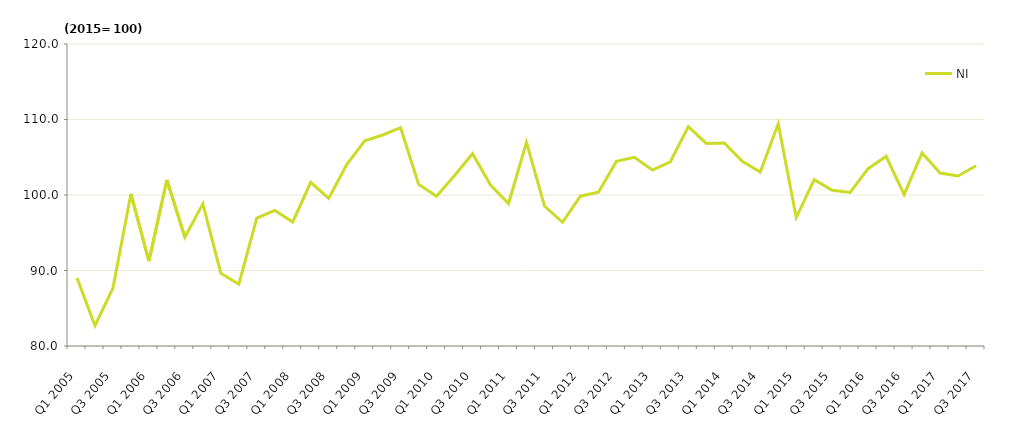
| Category | NI |
|---|---|
| Q1 2005 | 89.015 |
| Q2 2005 | 82.691 |
| Q3 2005 | 87.665 |
| Q4 2005 | 100.156 |
| Q1 2006 | 91.232 |
| Q2 2006 | 101.982 |
| Q3 2006 | 94.416 |
| Q4 2006 | 98.823 |
| Q1 2007 | 89.641 |
| Q2 2007 | 88.179 |
| Q3 2007 | 96.948 |
| Q4 2007 | 97.954 |
| Q1 2008 | 96.43 |
| Q2 2008 | 101.688 |
| Q3 2008 | 99.551 |
| Q4 2008 | 104.033 |
| Q1 2009 | 107.185 |
| Q2 2009 | 107.946 |
| Q3 2009 | 108.915 |
| Q4 2009 | 101.409 |
| Q1 2010 | 99.828 |
| Q2 2010 | 102.593 |
| Q3 2010 | 105.466 |
| Q4 2010 | 101.313 |
| Q1 2011 | 98.873 |
| Q2 2011 | 106.98 |
| Q3 2011 | 98.54 |
| Q4 2011 | 96.383 |
| Q1 2012 | 99.84 |
| Q2 2012 | 100.359 |
| Q3 2012 | 104.452 |
| Q4 2012 | 105 |
| Q1 2013 | 103.312 |
| Q2 2013 | 104.397 |
| Q3 2013 | 109.051 |
| Q4 2013 | 106.827 |
| Q1 2014 | 106.878 |
| Q2 2014 | 104.451 |
| Q3 2014 | 103.048 |
| Q4 2014 | 109.445 |
| Q1 2015 | 97.009 |
| Q2 2015 | 102.035 |
| Q3 2015 | 100.615 |
| Q4 2015 | 100.342 |
| Q1 2016 | 103.491 |
| Q2 2016 | 105.122 |
| Q3 2016 | 100.047 |
| Q4 2016 | 105.578 |
| Q1 2017 | 102.91 |
| Q2 2017 | 102.517 |
| Q3 2017 | 103.866 |